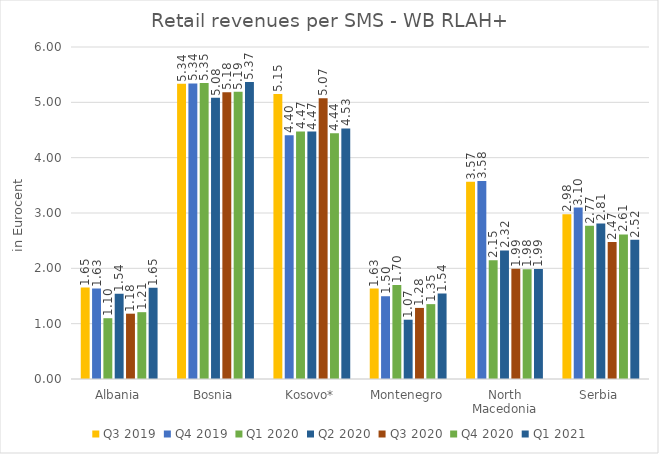
| Category | Q3 2019 | Q4 2019 | Q1 2020 | Q2 2020 | Q3 2020 | Q4 2020 | Q1 2021 |
|---|---|---|---|---|---|---|---|
| Albania | 1.652 | 1.634 | 1.099 | 1.54 | 1.18 | 1.208 | 1.647 |
| Bosnia | 5.336 | 5.342 | 5.348 | 5.081 | 5.182 | 5.19 | 5.369 |
| Kosovo* | 5.151 | 4.404 | 4.474 | 4.473 | 5.073 | 4.443 | 4.528 |
| Montenegro | 1.634 | 1.496 | 1.7 | 1.072 | 1.285 | 1.353 | 1.543 |
| North Macedonia | 3.565 | 3.577 | 2.147 | 2.323 | 1.99 | 1.983 | 1.988 |
| Serbia | 2.977 | 3.099 | 2.77 | 2.81 | 2.475 | 2.613 | 2.519 |